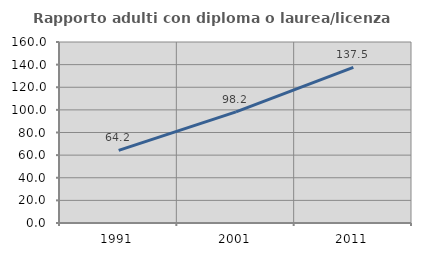
| Category | Rapporto adulti con diploma o laurea/licenza media  |
|---|---|
| 1991.0 | 64.225 |
| 2001.0 | 98.239 |
| 2011.0 | 137.55 |